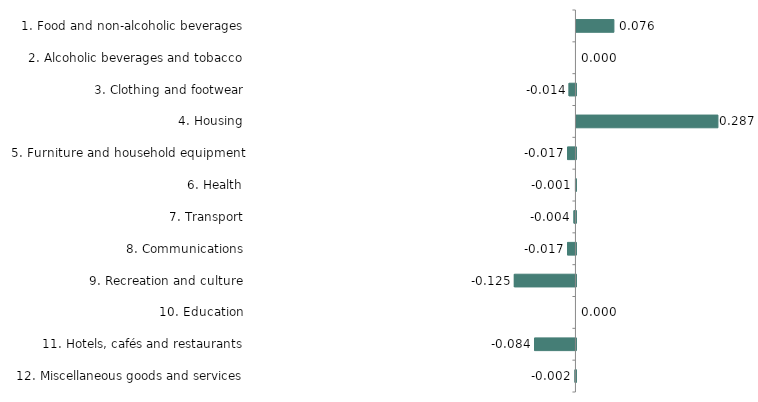
| Category | Series 0 |
|---|---|
| 1. Food and non-alcoholic beverages | 0.076 |
| 2. Alcoholic beverages and tobacco | 0 |
| 3. Clothing and footwear | -0.014 |
| 4. Housing | 0.287 |
| 5. Furniture and household equipment | -0.017 |
| 6. Health | -0.001 |
| 7. Transport | -0.004 |
| 8. Communications | -0.017 |
| 9. Recreation and culture | -0.125 |
| 10. Education | 0 |
| 11. Hotels, cafés and restaurants | -0.084 |
| 12. Miscellaneous goods and services | -0.002 |